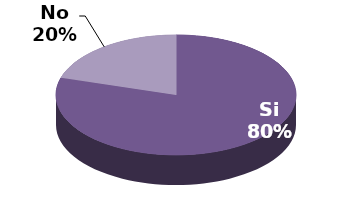
| Category | Series 1 |
|---|---|
| Si | 39 |
| No | 10 |